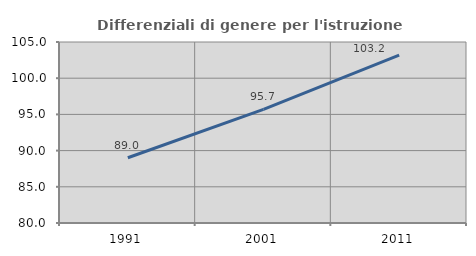
| Category | Differenziali di genere per l'istruzione superiore |
|---|---|
| 1991.0 | 89.011 |
| 2001.0 | 95.692 |
| 2011.0 | 103.186 |